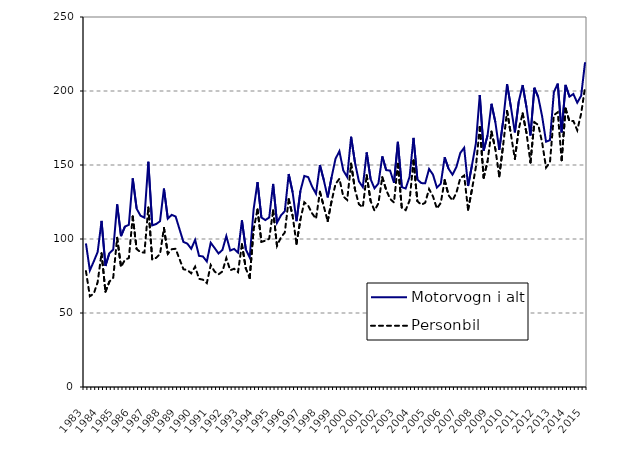
| Category | Motorvogn i alt | Personbil |
|---|---|---|
| 1983.0 | 97 | 78.3 |
| nan | 78.8 | 61.3 |
| nan | 84.8 | 63 |
| nan | 91.2 | 70.8 |
| 1984.0 | 112.2 | 90.4 |
| nan | 81.8 | 64.4 |
| nan | 90.4 | 71.1 |
| nan | 92.9 | 73.9 |
| 1985.0 | 123.4 | 100.8 |
| nan | 102 | 81.1 |
| nan | 108.4 | 86 |
| nan | 109.6 | 87.1 |
| 1986.0 | 141 | 115.2 |
| nan | 120.5 | 93.2 |
| nan | 115.7 | 91.1 |
| nan | 114.4 | 90.8 |
| 1987.0 | 152.2 | 121.3 |
| nan | 109.2 | 86.1 |
| nan | 110.1 | 87.3 |
| nan | 112 | 89.8 |
| 1988.0 | 134.1 | 107.5 |
| nan | 113.7 | 90 |
| nan | 116.3 | 93.1 |
| nan | 115.2 | 93.4 |
| 1989.0 | 106.6 | 86.4 |
| nan | 98 | 79.6 |
| nan | 96.9 | 79 |
| nan | 93.4 | 76.8 |
| 1990.0 | 99.4 | 81.3 |
| nan | 88.6 | 73.1 |
| nan | 88.2 | 72.5 |
| nan | 84.8 | 70.2 |
| 1991.0 | 97.5 | 82.4 |
| nan | 93.9 | 78 |
| nan | 90.2 | 76.1 |
| nan | 92.6 | 78.1 |
| 1992.0 | 102 | 87.1 |
| nan | 92.2 | 78.9 |
| nan | 93.3 | 79.9 |
| nan | 90.8 | 77.6 |
| 1993.0 | 112.6 | 96.5 |
| nan | 93 | 80.1 |
| nan | 87.5 | 73.6 |
| nan | 120.1 | 106.6 |
| 1994.0 | 138.4 | 120 |
| nan | 114.5 | 98.1 |
| nan | 112.8 | 98.8 |
| nan | 114.5 | 100.2 |
| 1995.0 | 137.2 | 119.3 |
| nan | 111 | 95.4 |
| nan | 115.9 | 101 |
| nan | 118.8 | 104.4 |
| 1996.0 | 143.9 | 126.9 |
| nan | 131.6 | 115.7 |
| nan | 112 | 96.7 |
| nan | 132.5 | 113.1 |
| 1997.0 | 142.6 | 124.8 |
| nan | 141.8 | 122.5 |
| nan | 135.4 | 117.3 |
| nan | 130.6 | 113.7 |
| 1998.0 | 150 | 131.9 |
| nan | 139.8 | 122 |
| nan | 128.1 | 112.1 |
| nan | 141.8 | 125.6 |
| 1999.0 | 154.2 | 137.1 |
| nan | 159.3 | 140.7 |
| nan | 146.3 | 128.7 |
| nan | 141.9 | 126.4 |
| 2000.0 | 169.1 | 150.9 |
| nan | 151.5 | 133.4 |
| nan | 139 | 123.5 |
| nan | 135.1 | 121.4 |
| 2001.0 | 158.5 | 143.1 |
| nan | 140.46 | 125.7 |
| nan | 134.24 | 119.2 |
| nan | 137.495 | 124.072 |
| 2002.0 | 155.814 | 141.724 |
| nan | 146.543 | 133.19 |
| nan | 146.231 | 127.141 |
| nan | 137.967 | 124.641 |
| 2003.0 | 165.679 | 150.811 |
| nan | 135.021 | 121.101 |
| nan | 134.111 | 119.491 |
| nan | 142.013 | 125.959 |
| 2004.0 | 168.309 | 153.043 |
| nan | 140.267 | 125.568 |
| nan | 137.77 | 123.121 |
| nan | 137.685 | 124.506 |
| 2005.0 | 147.311 | 133.756 |
| nan | 143.517 | 128.79 |
| nan | 134.783 | 120.571 |
| nan | 137.37 | 124.382 |
| 2006.0 | 155.213 | 139.728 |
| nan | 147.444 | 129.572 |
| nan | 143.451 | 126.006 |
| nan | 148.561 | 131.195 |
| 2007.0 | 158.1 | 141.084 |
| nan | 161.613 | 142.897 |
| nan | 135.821 | 119.753 |
| nan | 149.791 | 133.498 |
| 2008.0 | 164.642 | 148.614 |
| nan | 197.287 | 175.714 |
| nan | 159.718 | 141.407 |
| nan | 170.057 | 152.54 |
| 2009.0 | 191.38 | 172.559 |
| nan | 178.906 | 160.765 |
| nan | 160.234 | 142.312 |
| nan | 179.857 | 163.532 |
| 2010.0 | 204.636 | 186.507 |
| nan | 188.957 | 170.463 |
| nan | 172.077 | 154.156 |
| nan | 192.961 | 174.399 |
| 2011.0 | 204.005 | 184.86 |
| nan | 188.741 | 171.333 |
| nan | 169.934 | 151.694 |
| nan | 202.176 | 178.919 |
| 2012.0 | 195.829 | 177.072 |
| nan | 182.751 | 165.128 |
| nan | 165.73 | 148.242 |
| nan | 166.805 | 151.728 |
| 2013.0 | 199.181 | 183.653 |
| nan | 205.015 | 185.634 |
| nan | 172.044 | 153.21 |
| nan | 204.1 | 188.079 |
| 2014.0 | 196.177 | 179.552 |
| nan | 197.965 | 179.767 |
| nan | 192.105 | 173.474 |
| nan | 196.809 | 184.739 |
| 2015.0 | 219.419 | 202.592 |